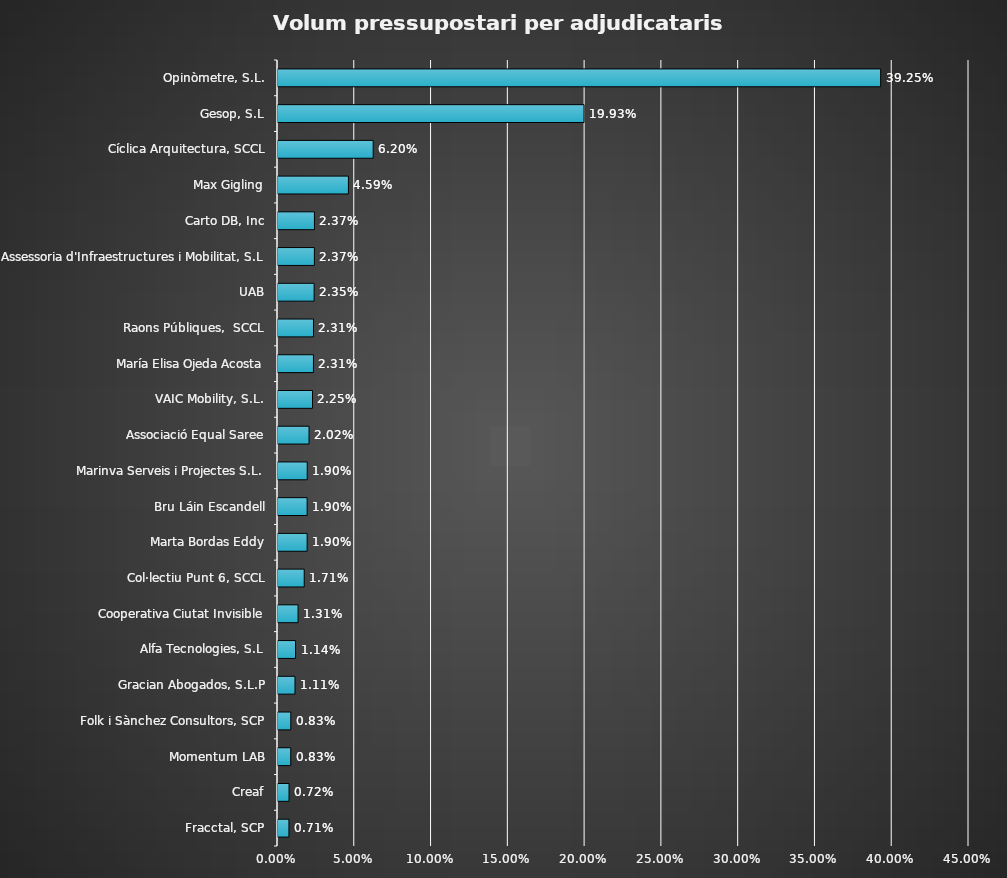
| Category | Series 0 |
|---|---|
| Fracctal, SCP | 0.007 |
| Creaf | 0.007 |
| Momentum LAB | 0.008 |
| Folk i Sànchez Consultors, SCP | 0.008 |
| Gracian Abogados, S.L.P | 0.011 |
| Alfa Tecnologies, S.L | 0.011 |
| Cooperativa Ciutat Invisible | 0.013 |
| Col·lectiu Punt 6, SCCL | 0.017 |
| Marta Bordas Eddy | 0.019 |
| Bru Láin Escandell | 0.019 |
| Marinva Serveis i Projectes S.L. | 0.019 |
| Associació Equal Saree | 0.02 |
| VAIC Mobility, S.L. | 0.022 |
| María Elisa Ojeda Acosta | 0.023 |
| Raons Públiques,  SCCL | 0.023 |
| UAB | 0.024 |
| Assessoria d'Infraestructures i Mobilitat, S.L | 0.024 |
| Carto DB, Inc | 0.024 |
| Max Gigling | 0.046 |
| Cíclica Arquitectura, SCCL | 0.062 |
| Gesop, S.L | 0.199 |
| Opinòmetre, S.L. | 0.392 |